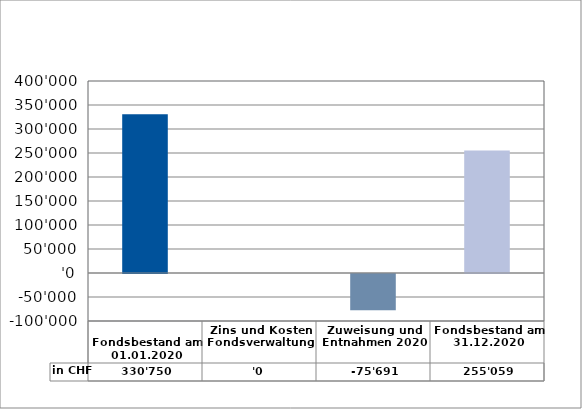
| Category | in CHF |
|---|---|
| 
Fondsbestand am 01.01.2020

 | 330750 |
| Zins und Kosten Fondsverwaltung | 0 |
| Zuweisung und Entnahmen 2020 | -75691 |
| Fondsbestand am 31.12.2020 | 255059 |